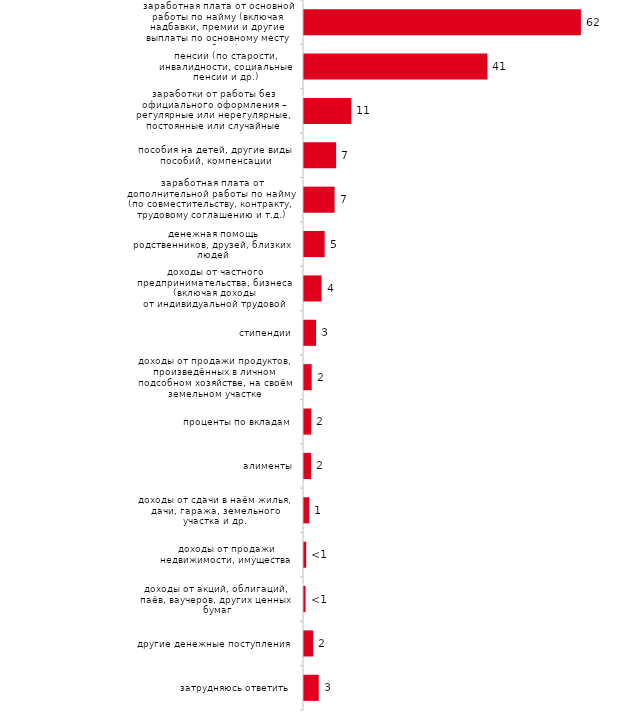
| Category | Series 0 |
|---|---|
| заработная плата от основной работы по найму (включая надбавки, премии и другие выплаты по основному месту работы) | 62.327 |
| пенсии (по старости, инвалидности, социальные пенсии и др.) | 41.287 |
| заработки от работы без официального оформления – регулярные или нерегулярные, постоянные или случайные (оказание частных услуг, торговля, производство товаров для продажи и т.п.) | 10.644 |
| пособия на детей, другие виды пособий, компенсации | 7.228 |
| заработная плата от дополнительной работы по найму (по совместительству, контракту, трудовому соглашению и т.д.) | 6.881 |
| денежная помощь родственников, друзей, близких людей | 4.653 |
| доходы от частного предпринимательства, бизнеса (включая доходы от индивидуальной трудовой деятельности) | 3.96 |
| стипендии | 2.723 |
| доходы от продажи продуктов, произведённых в личном подсобном хозяйстве, на своём земельном участке | 1.733 |
| проценты по вкладам | 1.634 |
| алименты | 1.584 |
| доходы от сдачи в наём жилья, дачи, гаража, земельного участка и др. | 1.188 |
| доходы от продажи недвижимости, имущества | 0.495 |
| доходы от акций, облигаций, паёв, ваучеров, других ценных бумаг | 0.347 |
| другие денежные поступления | 2.079 |
| затрудняюсь ответить | 3.317 |